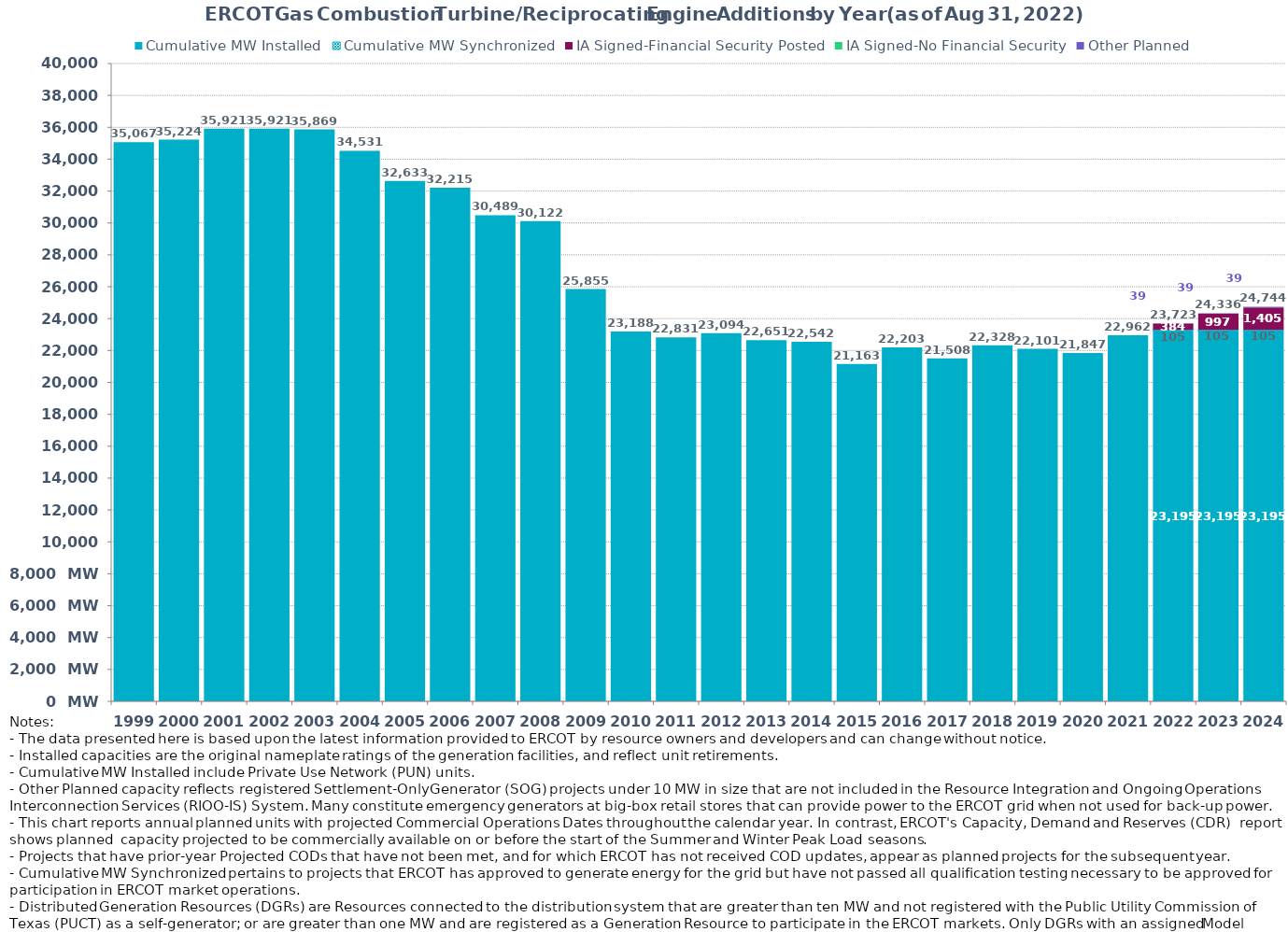
| Category | Cumulative MW Installed | Cumulative MW Synchronized | IA Signed-Financial Security Posted  | IA Signed-No Financial Security  | Other Planned | Cumulative Installed and Planned |
|---|---|---|---|---|---|---|
| 1999.0 | 35066.87 | 0 | 0 | 0 | 0 | 35066.87 |
| 2000.0 | 35224.48 | 0 | 0 | 0 | 0 | 35224.48 |
| 2001.0 | 35921.14 | 0 | 0 | 0 | 0 | 35921.14 |
| 2002.0 | 35921.14 | 0 | 0 | 0 | 0 | 35921.14 |
| 2003.0 | 35869.14 | 0 | 0 | 0 | 0 | 35869.14 |
| 2004.0 | 34531.24 | 0 | 0 | 0 | 0 | 34531.24 |
| 2005.0 | 32632.55 | 0 | 0 | 0 | 0 | 32632.55 |
| 2006.0 | 32214.65 | 0 | 0 | 0 | 0 | 32214.65 |
| 2007.0 | 30488.65 | 0 | 0 | 0 | 0 | 30488.65 |
| 2008.0 | 30121.65 | 0 | 0 | 0 | 0 | 30121.65 |
| 2009.0 | 25855.17 | 0 | 0 | 0 | 0 | 25855.17 |
| 2010.0 | 23188.05 | 0 | 0 | 0 | 0 | 23188.05 |
| 2011.0 | 22831.35 | 0 | 0 | 0 | 0 | 22831.35 |
| 2012.0 | 23093.55 | 0 | 0 | 0 | 0 | 23093.55 |
| 2013.0 | 22650.71 | 0 | 0 | 0 | 0 | 22650.71 |
| 2014.0 | 22541.71 | 0 | 0 | 0 | 0 | 22541.71 |
| 2015.0 | 21162.91 | 0 | 0 | 0 | 0 | 21162.91 |
| 2016.0 | 22203.29 | 0 | 0 | 0 | 0 | 22203.29 |
| 2017.0 | 21508.43 | 0 | 0 | 0 | 0 | 21508.43 |
| 2018.0 | 22327.59 | 0 | 0 | 0 | 0 | 22327.59 |
| 2019.0 | 22101.29 | 0 | 0 | 0 | 0 | 22101.29 |
| 2020.0 | 21846.64 | 0 | 0 | 0 | 0 | 21846.64 |
| 2021.0 | 22961.58 | 0 | 0 | 0 | 0 | 22961.58 |
| 2022.0 | 23195.08 | 105 | 384 | 0 | 38.5 | 23722.58 |
| 2023.0 | 23195.08 | 105 | 997.24 | 0 | 38.5 | 24335.82 |
| 2024.0 | 23195.08 | 105 | 1405.24 | 0 | 38.5 | 24743.82 |